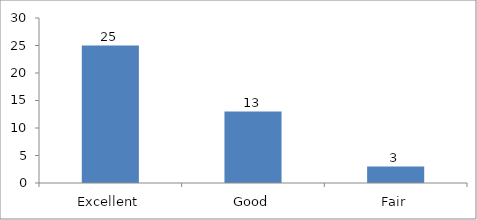
| Category | How would you rate this session or workshop? |
|---|---|
| Excellent | 25 |
| Good | 13 |
| Fair | 3 |